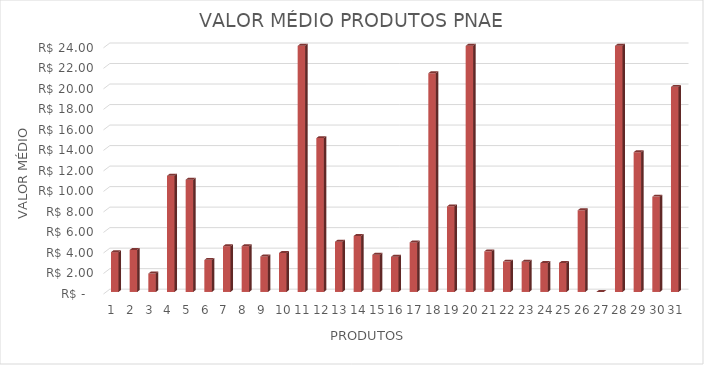
| Category | Series 0 |
|---|---|
| 0 | 3.883 |
| 1 | 4.097 |
| 2 | 1.797 |
| 3 | 11.33 |
| 4 | 10.95 |
| 5 | 3.13 |
| 6 | 4.463 |
| 7 | 4.463 |
| 8 | 3.463 |
| 9 | 3.797 |
| 10 | 27.275 |
| 11 | 15 |
| 12 | 4.9 |
| 13 | 5.463 |
| 14 | 3.63 |
| 15 | 3.43 |
| 16 | 4.833 |
| 17 | 21.325 |
| 18 | 8.345 |
| 19 | 49.95 |
| 20 | 3.963 |
| 21 | 2.963 |
| 22 | 2.95 |
| 23 | 2.83 |
| 24 | 2.83 |
| 25 | 7.963 |
| 26 | 0 |
| 27 | 33.5 |
| 28 | 13.633 |
| 29 | 9.297 |
| 30 | 20 |